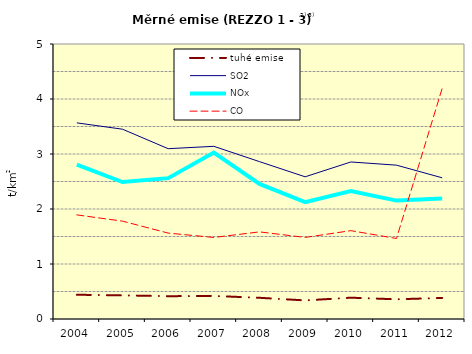
| Category | tuhé emise | SO2 | NOx | CO |
|---|---|---|---|---|
| 2004.0 | 0.441 | 3.566 | 2.808 | 1.893 |
| 2005.0 | 0.43 | 3.451 | 2.489 | 1.779 |
| 2006.0 | 0.415 | 3.097 | 2.561 | 1.562 |
| 2007.0 | 0.419 | 3.14 | 3.026 | 1.483 |
| 2008.0 | 0.386 | 2.861 | 2.456 | 1.584 |
| 2009.0 | 0.338 | 2.585 | 2.124 | 1.483 |
| 2010.0 | 0.388 | 2.855 | 2.328 | 1.606 |
| 2011.0 | 0.358 | 2.797 | 2.152 | 1.464 |
| 2012.0 | 0.383 | 2.567 | 2.189 | 4.194 |